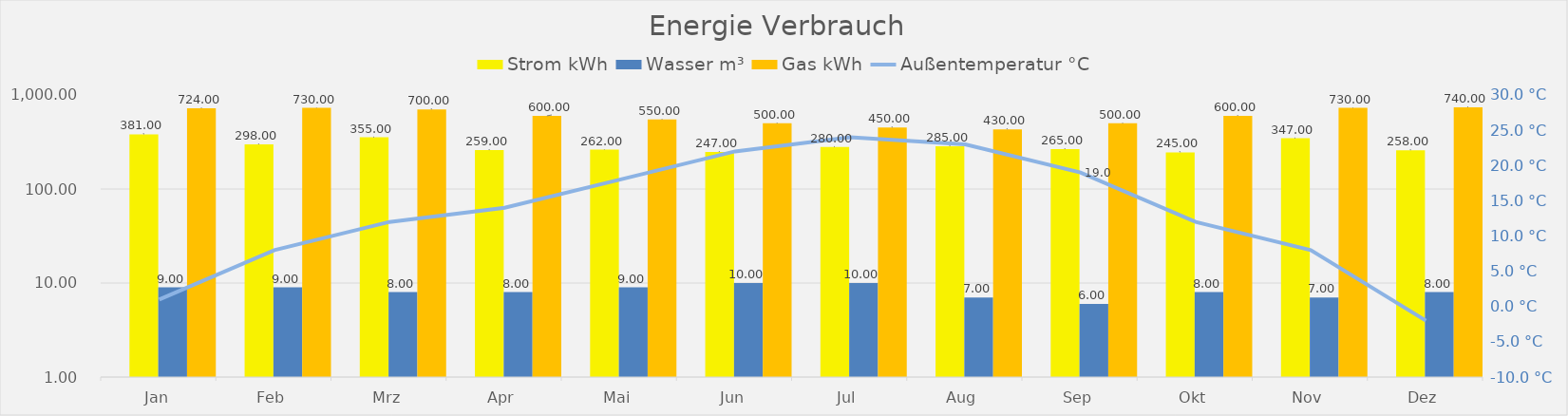
| Category | Series 0 | Strom kWh | Wasser m³ | Gas kWh |
|---|---|---|---|---|
| Jan |  | 381 | 9 | 724 |
| Feb |  | 298 | 9 | 730 |
| Mrz |  | 355 | 8 | 700 |
| Apr |  | 259 | 8 | 600 |
| Mai |  | 262 | 9 | 550 |
| Jun |  | 247 | 10 | 500 |
| Jul |  | 280 | 10 | 450 |
| Aug |  | 285 | 7 | 430 |
| Sep |  | 265 | 6 | 500 |
| Okt |  | 245 | 8 | 600 |
| Nov |  | 347 | 7 | 730 |
| Dez |  | 258 | 8 | 740 |